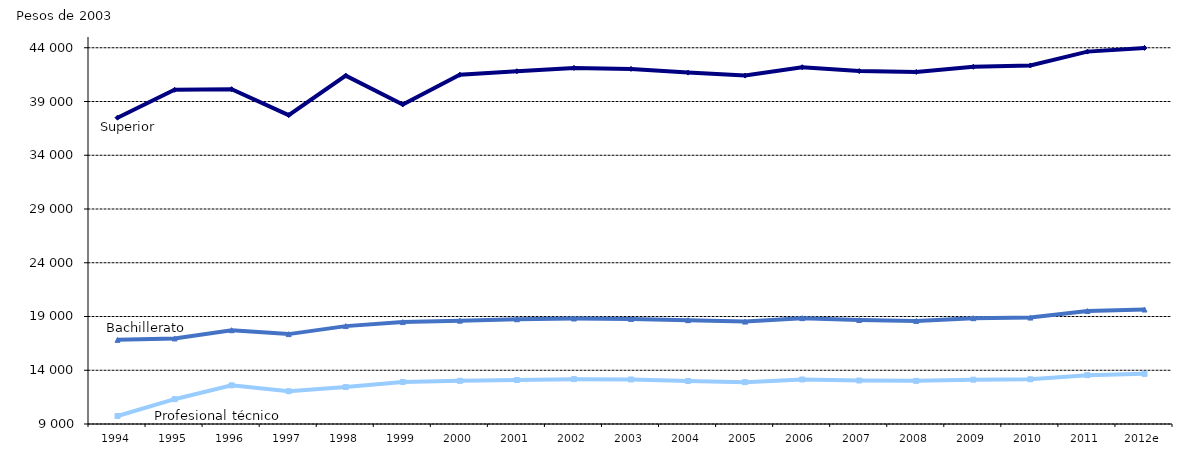
| Category | Profesional
 técnico | Bachillerato | Superior |
|---|---|---|---|
| 1994 | 9742.645 | 16828.206 | 37494.424 |
| 1995 | 11306.865 | 16960.297 | 40087.975 |
| 1996 | 12599.129 | 17724.198 | 40146.376 |
| 1997 | 12046.809 | 17361.577 | 37734.856 |
| 1998 | 12437.416 | 18105.099 | 41405.574 |
| 1999 | 12908.719 | 18479.851 | 38726.158 |
| 2000 | 13018.794 | 18615.658 | 41489.8 |
| 2001 | 13087.838 | 18744.446 | 41814.533 |
| 2002 | 13170.643 | 18815.204 | 42125.151 |
| 2003 | 13141.8 | 18774 | 42032.9 |
| 2004 | 13002.304 | 18659.795 | 41686.776 |
| 2005 | 12895.325 | 18525.679 | 41410.34 |
| 2006 | 13141.436 | 18847.586 | 42190.926 |
| 2007 | 13045.723 | 18671.691 | 41827.85 |
| 2008 | 13013.566 | 18590.808 | 41751.857 |
| 2009 | 13123.154 | 18841.623 | 42228.697 |
| 2010 | 13160.701 | 18901.007 | 42352.257 |
| 2011 | 13541.234 | 19507.422 | 43640.314 |
| 2012e | 13663.942 | 19650.051 | 43984.881 |